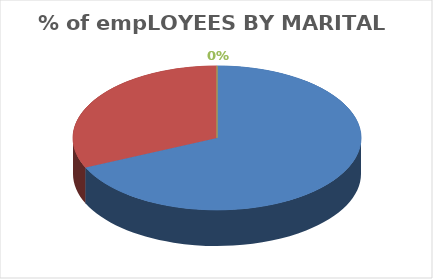
| Category | % |
|---|---|
| Married | 0.683 |
| Single | 0.317 |